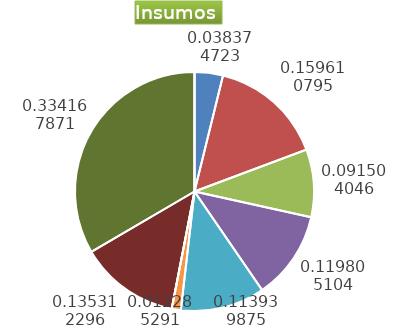
| Category | Series 0 |
|---|---|
| Control arvenses | 1458850 |
| Control fitosanitario | 5877670 |
| Cosecha y beneficio | 3478609.529 |
| Fertilización | 4554500 |
| Instalación | 4331527.987 |
| Otros | 467036.515 |
| Podas | 0 |
| Riego | 5144020 |
| Transporte | 12703695.6 |
| Tutorado | 0 |